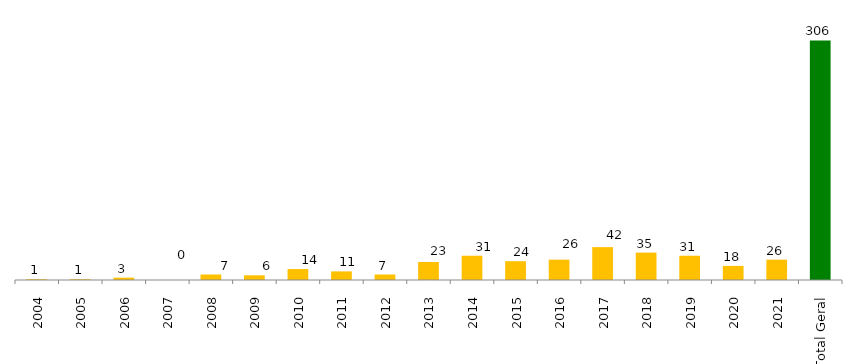
| Category | Categoria/Ano |
|---|---|
| 2004 | 1 |
| 2005 | 1 |
| 2006 | 3 |
| 2007 | 0 |
| 2008 | 7 |
| 2009 | 6 |
| 2010 | 14 |
| 2011 | 11 |
| 2012 | 7 |
| 2013 | 23 |
| 2014 | 31 |
| 2015 | 24 |
| 2016 | 26 |
| 2017 | 42 |
| 2018 | 35 |
| 2019 | 31 |
| 2020 | 18 |
| 2021 | 26 |
| Total Geral | 306 |